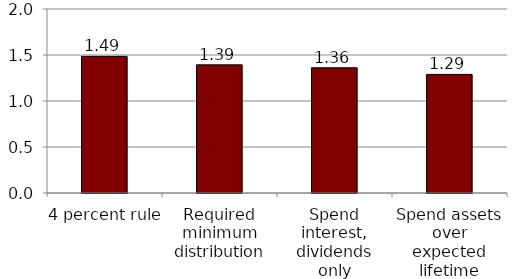
| Category | Series 0 |
|---|---|
| 4 percent rule | 1.485 |
| Required minimum distribution | 1.393 |
| Spend interest, dividends only | 1.361 |
| Spend assets over expected lifetime | 1.289 |